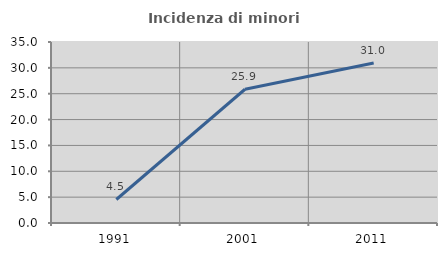
| Category | Incidenza di minori stranieri |
|---|---|
| 1991.0 | 4.545 |
| 2001.0 | 25.862 |
| 2011.0 | 30.952 |